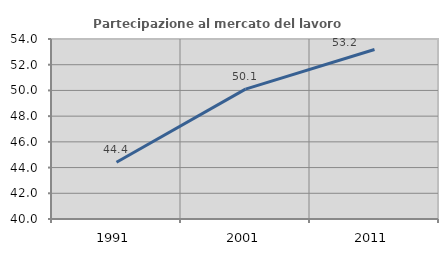
| Category | Partecipazione al mercato del lavoro  femminile |
|---|---|
| 1991.0 | 44.412 |
| 2001.0 | 50.105 |
| 2011.0 | 53.182 |